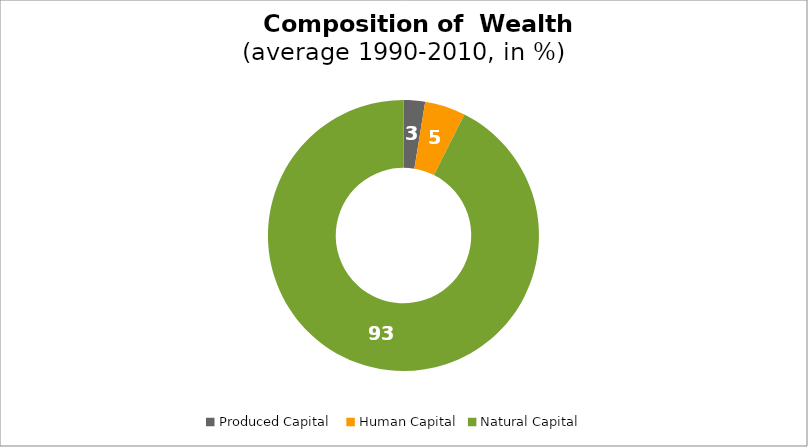
| Category | Series 0 |
|---|---|
| Produced Capital  | 2.563 |
| Human Capital | 4.864 |
| Natural Capital | 92.573 |